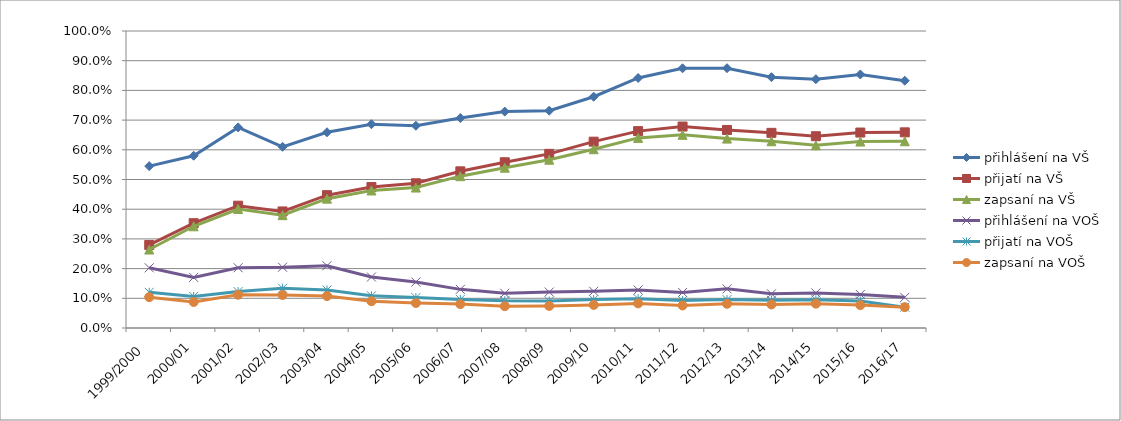
| Category | přihlášení na VŠ | přijatí na VŠ | zapsaní na VŠ | přihlášení na VOŠ | přijatí na VOŠ | zapsaní na VOŠ |
|---|---|---|---|---|---|---|
| 1999/2000 | 0.545 | 0.28 | 0.264 | 0.203 | 0.12 | 0.104 |
| 2000/01 | 0.58 | 0.353 | 0.342 | 0.17 | 0.106 | 0.088 |
| 2001/02 | 0.675 | 0.412 | 0.401 | 0.203 | 0.123 | 0.112 |
| 2002/03 | 0.61 | 0.392 | 0.38 | 0.205 | 0.134 | 0.111 |
| 2003/04 | 0.659 | 0.447 | 0.436 | 0.21 | 0.128 | 0.107 |
| 2004/05 | 0.686 | 0.475 | 0.463 | 0.172 | 0.108 | 0.09 |
| 2005/06 | 0.681 | 0.487 | 0.473 | 0.155 | 0.102 | 0.084 |
| 2006/07 | 0.707 | 0.527 | 0.511 | 0.13 | 0.096 | 0.08 |
| 2007/08 | 0.729 | 0.558 | 0.54 | 0.117 | 0.092 | 0.073 |
| 2008/09 | 0.732 | 0.586 | 0.567 | 0.121 | 0.091 | 0.074 |
| 2009/10 | 0.779 | 0.627 | 0.602 | 0.124 | 0.096 | 0.078 |
| 2010/11 | 0.842 | 0.663 | 0.64 | 0.128 | 0.099 | 0.083 |
| 2011/12 | 0.874 | 0.678 | 0.65 | 0.12 | 0.092 | 0.076 |
| 2012/13 | 0.875 | 0.667 | 0.638 | 0.132 | 0.096 | 0.082 |
| 2013/14 | 0.845 | 0.657 | 0.629 | 0.115 | 0.093 | 0.079 |
| 2014/15 | 0.838 | 0.646 | 0.615 | 0.118 | 0.095 | 0.082 |
| 2015/16 | 0.854 | 0.658 | 0.628 | 0.113 | 0.091 | 0.077 |
| 2016/17 | 0.833 | 0.659 | 0.629 | 0.103 | 0.07 | 0.07 |